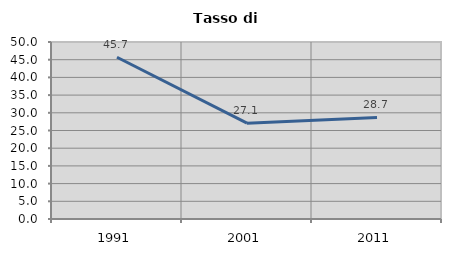
| Category | Tasso di disoccupazione   |
|---|---|
| 1991.0 | 45.697 |
| 2001.0 | 27.059 |
| 2011.0 | 28.675 |